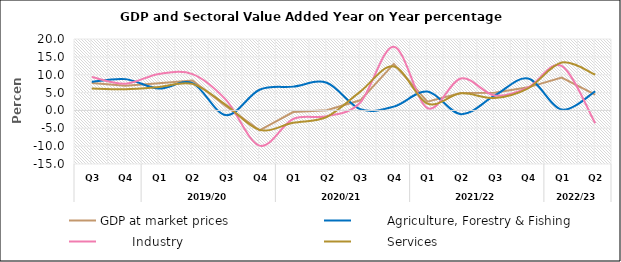
| Category | GDP at market prices |         Agriculture, Forestry & Fishing |         Industry |         Services |
|---|---|---|---|---|
| 0 | 7.669 | 8.016 | 9.372 | 6.151 |
| 1 | 6.889 | 8.766 | 7.493 | 5.925 |
| 2 | 7.58 | 6.125 | 10.211 | 6.533 |
| 3 | 8.371 | 7.657 | 10.18 | 7.433 |
| 4 | 1.193 | -1.31 | 2.943 | 1.522 |
| 5 | -5.566 | 5.794 | -9.865 | -5.441 |
| 6 | -0.456 | 6.665 | -2.405 | -3.46 |
| 7 | 0.06 | 7.748 | -1.622 | -1.837 |
| 8 | 2.831 | 0.353 | 2.204 | 5.264 |
| 9 | 13.016 | 1.056 | 17.86 | 12.33 |
| 10 | 2.459 | 5.301 | 0.648 | 1.915 |
| 11 | 4.897 | -1.062 | 8.965 | 4.785 |
| 12 | 4.946 | 4.118 | 4.209 | 3.462 |
| 13 | 6.459 | 8.916 | 6.451 | 6.164 |
| 14 | 9.215 | 0.244 | 12.468 | 13.395 |
| 15 | 4.439 | 5.34 | -3.601 | 10.027 |